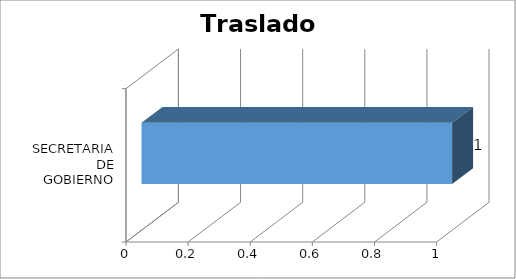
| Category | Total |
|---|---|
| SECRETARIA DE GOBIERNO | 1 |